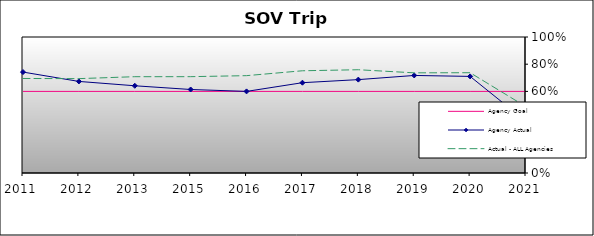
| Category | Agency Goal | Agency Actual | Actual - ALL Agencies |
|---|---|---|---|
| 2011.0 | 0.6 | 0.742 | 0.695 |
| 2012.0 | 0.6 | 0.673 | 0.694 |
| 2013.0 | 0.6 | 0.641 | 0.708 |
| 2015.0 | 0.6 | 0.614 | 0.708 |
| 2016.0 | 0.6 | 0.6 | 0.716 |
| 2017.0 | 0.6 | 0.664 | 0.752 |
| 2018.0 | 0.6 | 0.687 | 0.759 |
| 2019.0 | 0.6 | 0.717 | 0.736 |
| 2020.0 | 0.6 | 0.71 | 0.737 |
| 2021.0 | 0.6 | 0.379 | 0.487 |